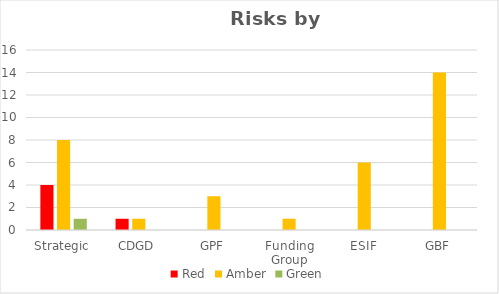
| Category | Red | Amber | Green |
|---|---|---|---|
| Strategic | 4 | 8 | 1 |
| CDGD | 1 | 1 | 0 |
| GPF | 0 | 3 | 0 |
| Funding Group | 0 | 1 | 0 |
| ESIF | 0 | 6 | 0 |
| GBF | 0 | 14 | 0 |